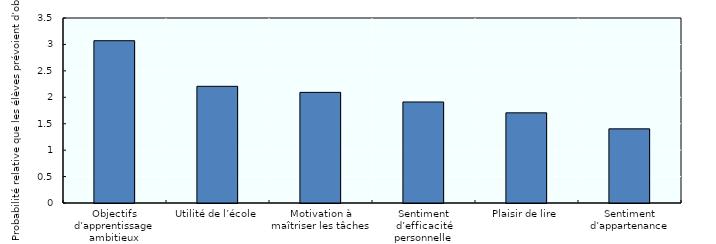
| Category | Series 0 |
|---|---|
| Objectifs d’apprentissage ambitieux | 3.07 |
| Utilité de l’école | 2.208 |
| Motivation à maîtriser les tâches | 2.093 |
| Sentiment d’efficacité personnelle | 1.911 |
| Plaisir de lire | 1.706 |
| Sentiment d’appartenance | 1.403 |